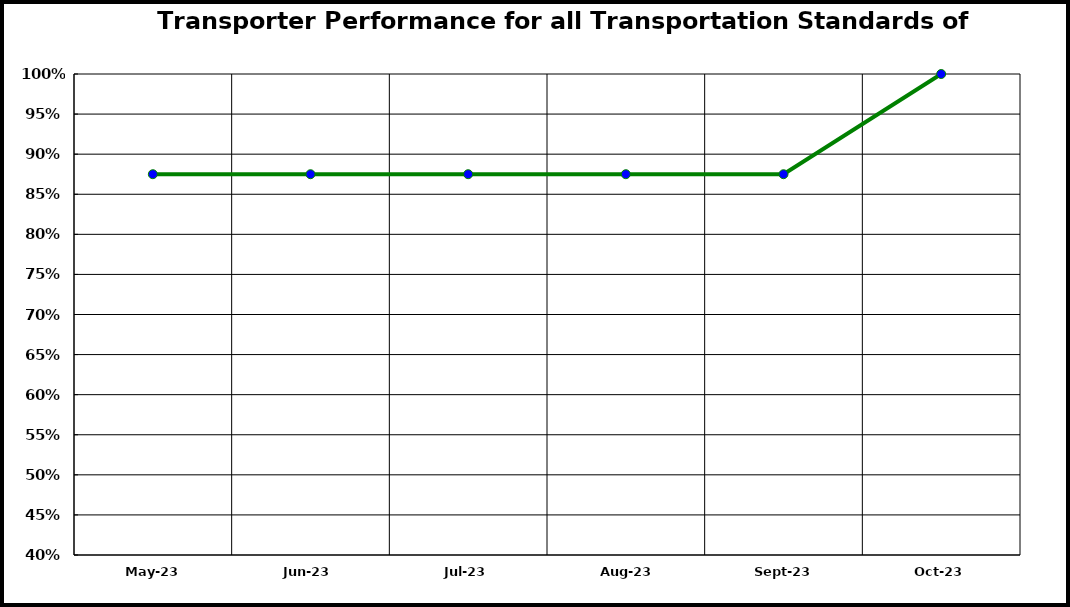
| Category | Performance |
|---|---|
| 2023-05-01 | 0.875 |
| 2023-06-01 | 0.875 |
| 2023-07-01 | 0.875 |
| 2023-08-01 | 0.875 |
| 2023-09-01 | 0.875 |
| 2023-10-01 | 1 |